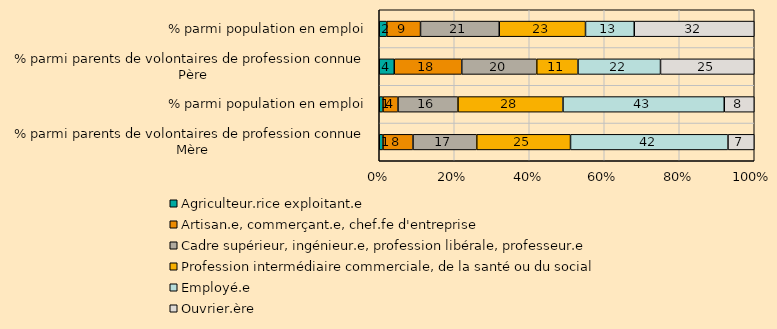
| Category | Agriculteur.rice exploitant.e | Artisan.e, commerçant.e, chef.fe d'entreprise | Cadre supérieur, ingénieur.e, profession libérale, professeur.e | Profession intermédiaire commerciale, de la santé ou du social | Employé.e | Ouvrier.ère |
|---|---|---|---|---|---|---|
| 0 | 1 | 8 | 17 | 25 | 42 | 7 |
| 1 | 1 | 4 | 16 | 28 | 43 | 8 |
| 2 | 4 | 18 | 20 | 11 | 22 | 25 |
| 3 | 2 | 9 | 21 | 23 | 13 | 32 |